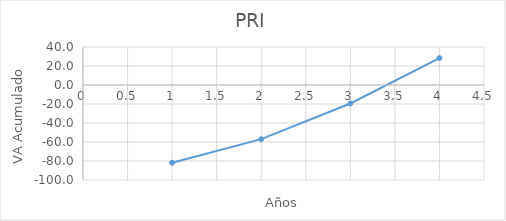
| Category | Series 0 |
|---|---|
| 1.0 | -81.818 |
| 2.0 | -57.025 |
| 3.0 | -19.459 |
| 4.0 | 28.352 |